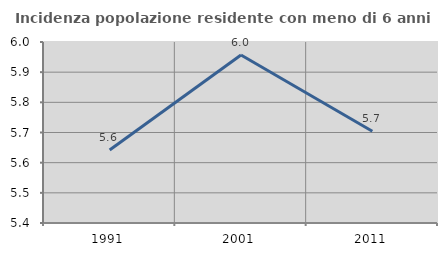
| Category | Incidenza popolazione residente con meno di 6 anni |
|---|---|
| 1991.0 | 5.642 |
| 2001.0 | 5.957 |
| 2011.0 | 5.704 |